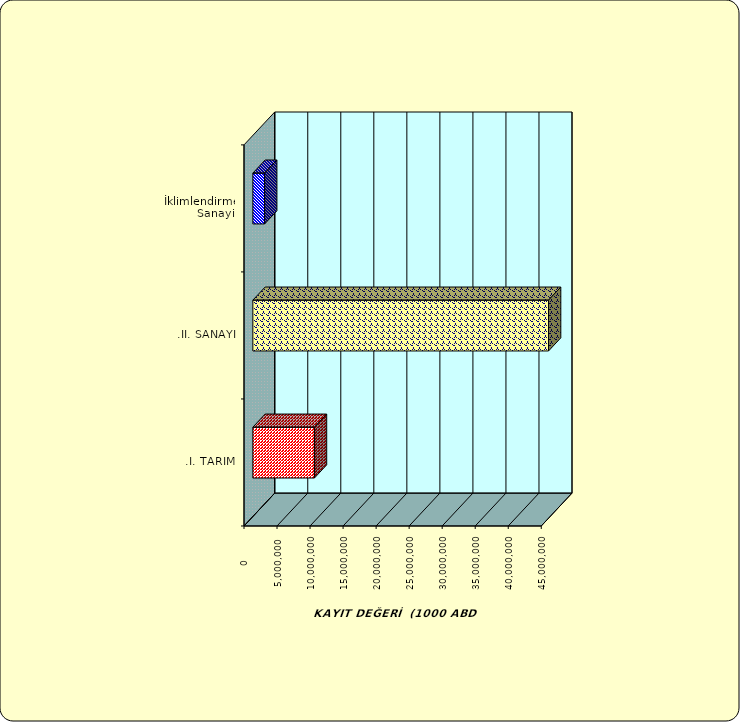
| Category | Series 0 |
|---|---|
| .I. TARIM | 9320705.939 |
| .II. SANAYİ | 44759748.81 |
|  İklimlendirme Sanayii | 1783420.316 |